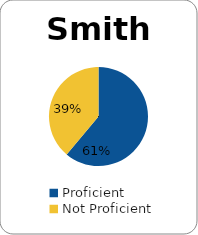
| Category | Series 0 |
|---|---|
| Proficient | 0.611 |
| Not Proficient | 0.389 |